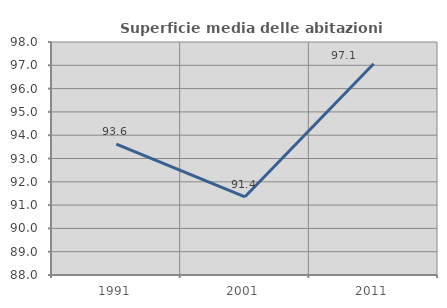
| Category | Superficie media delle abitazioni occupate |
|---|---|
| 1991.0 | 93.615 |
| 2001.0 | 91.358 |
| 2011.0 | 97.067 |